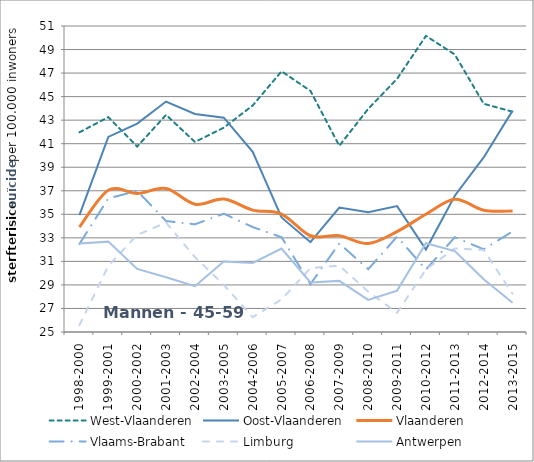
| Category | West-Vlaanderen | Oost-Vlaanderen | Vlaanderen | Vlaams-Brabant | Limburg | Antwerpen |
|---|---|---|---|---|---|---|
| 1998-2000 | 41.967 | 34.931 | 33.906 | 32.481 | 25.586 | 32.521 |
| 1999-2001 | 43.258 | 41.576 | 37.049 | 36.35 | 30.622 | 32.678 |
| 2000-2002 | 40.757 | 42.709 | 36.767 | 36.992 | 33.247 | 30.36 |
| 2001-2003 | 43.45 | 44.58 | 37.2 | 34.427 | 34.293 | 29.654 |
| 2002-2004 | 41.148 | 43.528 | 35.86 | 34.151 | 31.365 | 28.892 |
| 2003-2005 | 42.361 | 43.207 | 36.292 | 35.052 | 29.001 | 30.999 |
| 2004-2006 | 44.244 | 40.311 | 35.358 | 33.917 | 26.256 | 30.869 |
| 2005-2007 | 47.151 | 34.73 | 35.024 | 33.053 | 27.771 | 32.087 |
| 2006-2008 | 45.488 | 32.632 | 33.18 | 29.066 | 30.428 | 29.217 |
| 2007-2009 | 40.822 | 35.578 | 33.175 | 32.527 | 30.636 | 29.343 |
| 2008-2010 | 43.959 | 35.17 | 32.518 | 30.335 | 28.433 | 27.73 |
| 2009-2011 | 46.508 | 35.698 | 33.534 | 33.099 | 26.634 | 28.519 |
| 2010-2012 | 50.159 | 32.014 | 35.003 | 30.305 | 30.31 | 32.54 |
| 2011-2013 | 48.579 | 36.577 | 36.281 | 33.052 | 32.099 | 31.878 |
| 2012-2014 | 44.391 | 39.834 | 35.34 | 32.027 | 31.971 | 29.481 |
| 2013-2015 | 43.717 | 43.808 | 35.282 | 33.545 | 28.244 | 27.482 |